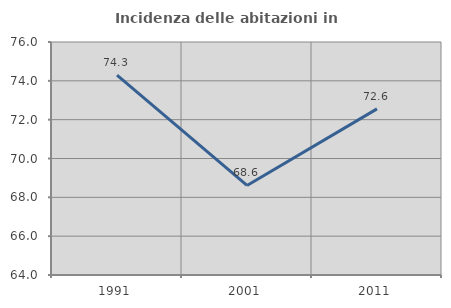
| Category | Incidenza delle abitazioni in proprietà  |
|---|---|
| 1991.0 | 74.292 |
| 2001.0 | 68.613 |
| 2011.0 | 72.555 |